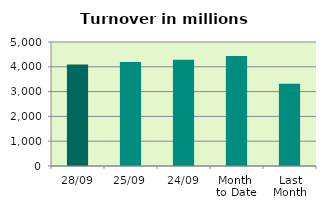
| Category | Series 0 |
|---|---|
| 28/09 | 4091.469 |
| 25/09 | 4191.228 |
| 24/09 | 4285.251 |
| Month 
to Date | 4439.751 |
| Last
Month | 3319.434 |